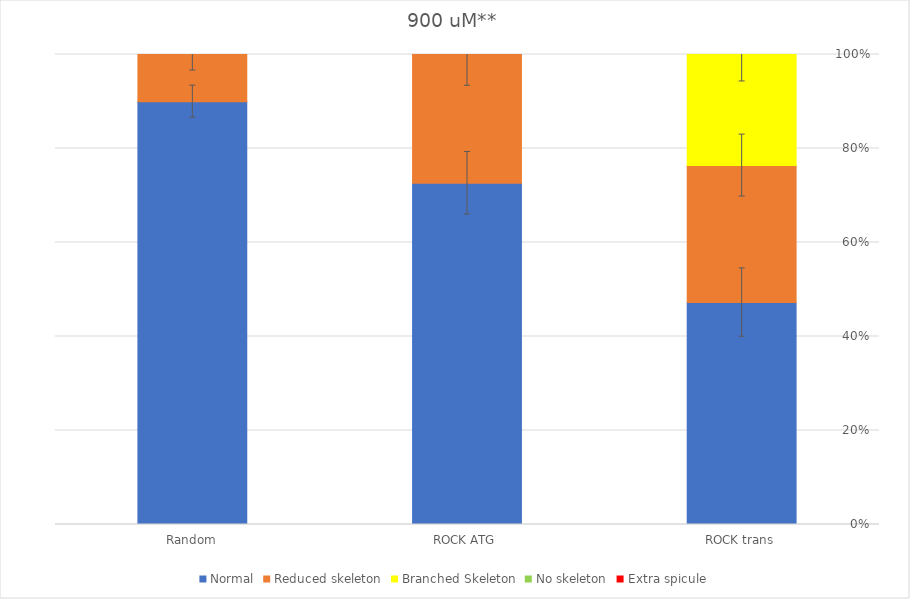
| Category | Normal | Reduced skeleton | Branched Skeleton | No skeleton | Extra spicule |
|---|---|---|---|---|---|
| ROCK trans | 47.223 | 29.148 | 23.629 | 0 | 0 |
| ROCK ATG | 72.609 | 27.391 | 0 | 0 | 0 |
| Random | 89.969 | 10.031 | 0 | 0 | 0 |